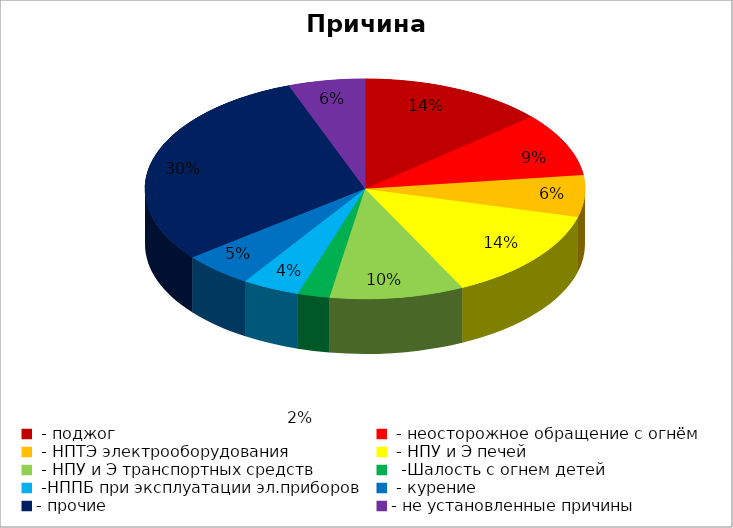
| Category | Причина пожара |
|---|---|
|  - поджог | 29 |
|  - неосторожное обращение с огнём | 20 |
|  - НПТЭ электрооборудования | 13 |
|  - НПУ и Э печей | 29 |
|  - НПУ и Э транспортных средств | 21 |
|   -Шалость с огнем детей | 5 |
|  -НППБ при эксплуатации эл.приборов | 9 |
|  - курение | 11 |
| - прочие | 64 |
| - не установленные причины | 12 |